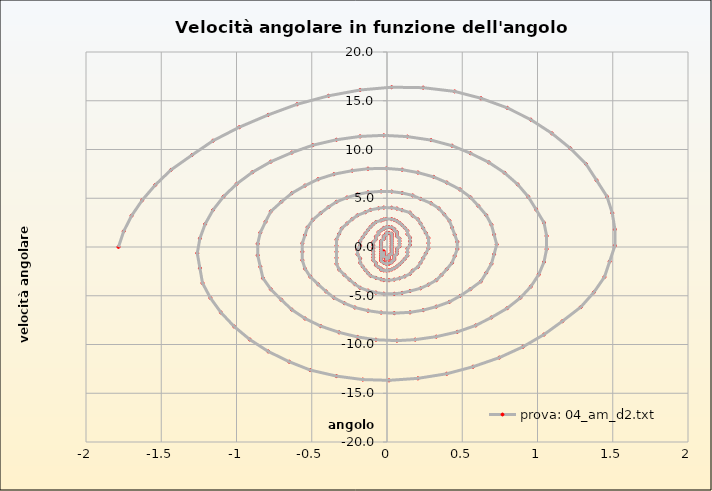
| Category | prova: 04_am_d2.txt |
|---|---|
| -1.7842898446441338 | 0 |
| -1.7493832596041339 | 1.613 |
| -1.6970233820441338 | 3.207 |
| -1.6272102119641338 | 4.789 |
| -1.539943749364134 | 6.357 |
| -1.4352239942541338 | 7.909 |
| -1.2955976540941339 | 9.43 |
| -1.1559713139341339 | 10.9 |
| -0.9814383887311339 | 12.287 |
| -0.7894521710111339 | 13.55 |
| -0.5974659532921338 | 14.64 |
| -0.3880264430531338 | 15.508 |
| -0.1785869328131338 | 16.104 |
| 0.030852577425766213 | 16.389 |
| 0.24029208766486623 | 16.341 |
| 0.4497315979048662 | 15.957 |
| 0.6242645231038662 | 15.256 |
| 0.7987974483028661 | 14.273 |
| 0.9558770809828662 | 13.056 |
| 1.095503421145866 | 11.657 |
| 1.217676468785866 | 10.127 |
| 1.3223962239058662 | 8.512 |
| 1.3922093939858662 | 6.848 |
| 1.4620225640658662 | 5.163 |
| 1.4969291491058663 | 3.476 |
| 1.5143824416258662 | 1.801 |
| 1.5143824416258662 | 0.145 |
| 1.4794758565858661 | -1.485 |
| 1.4445692715458662 | -3.085 |
| 1.3747561014658662 | -4.647 |
| 1.287489638865866 | -6.162 |
| 1.165316591225866 | -7.613 |
| 1.0431435435858663 | -8.979 |
| 0.9035172034228661 | -10.235 |
| 0.7464375707438662 | -11.347 |
| 0.5719046455438662 | -12.28 |
| 0.39737172034486623 | -12.999 |
| 0.20538550262486624 | -13.472 |
| 0.013399284905866215 | -13.676 |
| -0.16113364029313376 | -13.598 |
| -0.3356665654931338 | -13.242 |
| -0.5101994906921339 | -12.622 |
| -0.6498258308521339 | -11.766 |
| -0.7894521710111339 | -10.709 |
| -0.9116252186511339 | -9.489 |
| -1.016344973774134 | -8.145 |
| -1.1036114363741338 | -6.713 |
| -1.1734246064541338 | -5.223 |
| -1.2257844840141339 | -3.701 |
| -1.2432377765341338 | -2.166 |
| -1.2606910690541338 | -0.637 |
| -1.2432377765341338 | 0.875 |
| -1.208331191494134 | 2.355 |
| -1.1559713139341339 | 3.792 |
| -1.086158143854134 | 5.168 |
| -0.9988916812541337 | 6.468 |
| -0.8941719261311338 | 7.67 |
| -0.7719988784911338 | 8.751 |
| -0.6323725383321338 | 9.683 |
| -0.4927461981721338 | 10.442 |
| -0.3356665654931338 | 11.002 |
| -0.1785869328131338 | 11.342 |
| -0.021507300134033784 | 11.451 |
| 0.13557233254586623 | 11.323 |
| 0.29265196522486625 | 10.964 |
| 0.4322783053848662 | 10.388 |
| 0.5544513530238662 | 9.617 |
| 0.6766244006638662 | 8.679 |
| 0.7813441557838662 | 7.603 |
| 0.8686106183828661 | 6.419 |
| 0.9384237884628662 | 5.156 |
| 0.9907836660228662 | 3.84 |
| 1.0431435435858663 | 2.493 |
| 1.0605968361058662 | 1.136 |
| 1.0605968361058662 | -0.214 |
| 1.0431435435858663 | -1.541 |
| 1.0082369585428663 | -2.828 |
| 0.9558770809828662 | -4.059 |
| 0.8860639109028662 | -5.215 |
| 0.7987974483028661 | -6.279 |
| 0.6940776931838661 | -7.229 |
| 0.5893579380638662 | -8.045 |
| 0.4671848904248662 | -8.707 |
| 0.32755855026486624 | -9.197 |
| 0.18793221010486622 | -9.499 |
| 0.06575916246566621 | -9.605 |
| -0.07386717769383379 | -9.513 |
| -0.19604022533313378 | -9.226 |
| -0.3182132729731338 | -8.755 |
| -0.44038632061313376 | -8.116 |
| -0.5451060757321339 | -7.331 |
| -0.6323725383321338 | -6.423 |
| -0.7021857084121338 | -5.415 |
| -0.7719988784911338 | -4.331 |
| -0.8243587560511338 | -3.195 |
| -0.8418120485711338 | -2.028 |
| -0.8592653410911338 | -0.848 |
| -0.8592653410911338 | 0.327 |
| -0.8418120485711338 | 1.478 |
| -0.8069054635311338 | 2.589 |
| -0.7719988784911338 | 3.643 |
| -0.7021857084121338 | 4.624 |
| -0.6323725383321338 | 5.514 |
| -0.5451060757321339 | 6.295 |
| -0.4578396131321338 | 6.951 |
| -0.3531198580131338 | 7.466 |
| -0.23094681037313378 | 7.829 |
| -0.12622705525413377 | 8.029 |
| -0.004054007614033786 | 8.062 |
| 0.10066574750556621 | 7.928 |
| 0.20538550262486624 | 7.634 |
| 0.31010525774486625 | 7.188 |
| 0.39737172034486623 | 6.605 |
| 0.48463818294386624 | 5.903 |
| 0.5544513530238662 | 5.1 |
| 0.6068112305838662 | 4.216 |
| 0.6591711081438661 | 3.271 |
| 0.6940776931838661 | 2.284 |
| 0.7115309857038662 | 1.274 |
| 0.7289842782238661 | 0.259 |
| 0.7115309857038662 | -0.745 |
| 0.6940776931838661 | -1.72 |
| 0.6591711081438661 | -2.652 |
| 0.6242645231038662 | -3.525 |
| 0.5544513530238662 | -4.322 |
| 0.48463818294386624 | -5.029 |
| 0.4148250128648662 | -5.633 |
| 0.32755855026486624 | -6.119 |
| 0.24029208766486623 | -6.478 |
| 0.15302562506586623 | -6.702 |
| 0.04830586994576621 | -6.785 |
| -0.038960592653933784 | -6.728 |
| -0.12622705525413377 | -6.533 |
| -0.21349351785313378 | -6.206 |
| -0.2833066879331338 | -5.759 |
| -0.3531198580131338 | -5.204 |
| -0.40547973557313377 | -4.555 |
| -0.4578396131321338 | -3.829 |
| -0.5101994906921339 | -3.043 |
| -0.5451060757321339 | -2.213 |
| -0.5625593682521338 | -1.356 |
| -0.5625593682521338 | -0.489 |
| -0.5625593682521338 | 0.374 |
| -0.5451060757321339 | 1.217 |
| -0.5276527832121338 | 2.025 |
| -0.4927461981721338 | 2.784 |
| -0.44038632061313376 | 3.48 |
| -0.3880264430531338 | 4.101 |
| -0.3356665654931338 | 4.634 |
| -0.2658533954131338 | 5.068 |
| -0.19604022533313378 | 5.396 |
| -0.12622705525413377 | 5.609 |
| -0.038960592653933784 | 5.705 |
| 0.030852577425766213 | 5.682 |
| 0.10066574750556621 | 5.542 |
| 0.17047891758486622 | 5.29 |
| 0.22283879514486624 | 4.934 |
| 0.29265196522486625 | 4.484 |
| 0.34501184278486624 | 3.951 |
| 0.37991842782486623 | 3.349 |
| 0.4148250128648662 | 2.691 |
| 0.4322783053848662 | 1.993 |
| 0.4497315979048662 | 1.267 |
| 0.4671848904248662 | 0.53 |
| 0.4671848904248662 | -0.206 |
| 0.4497315979048662 | -0.927 |
| 0.4322783053848662 | -1.619 |
| 0.39737172034486623 | -2.27 |
| 0.36246513530486624 | -2.868 |
| 0.32755855026486624 | -3.401 |
| 0.27519867270486625 | -3.861 |
| 0.22283879514486624 | -4.236 |
| 0.15302562506586623 | -4.521 |
| 0.10066574750556621 | -4.71 |
| 0.04830586994576621 | -4.8 |
| -0.021507300134033784 | -4.789 |
| -0.07386717769383379 | -4.68 |
| -0.12622705525413377 | -4.476 |
| -0.1785869328131338 | -4.184 |
| -0.21349351785313378 | -3.81 |
| -0.2484001028931338 | -3.366 |
| -0.2833066879331338 | -2.862 |
| -0.3182132729731338 | -2.309 |
| -0.3356665654931338 | -1.719 |
| -0.3356665654931338 | -1.105 |
| -0.3356665654931338 | -0.48 |
| -0.3356665654931338 | 0.145 |
| -0.3356665654931338 | 0.757 |
| -0.3182132729731338 | 1.345 |
| -0.3007599804531338 | 1.899 |
| -0.2658533954131338 | 2.406 |
| -0.23094681037313378 | 2.859 |
| -0.19604022533313378 | 3.248 |
| -0.14368034777313377 | 3.566 |
| -0.10877376273413379 | 3.807 |
| -0.05641388517393378 | 3.966 |
| -0.021507300134033784 | 4.042 |
| 0.030852577425766213 | 4.034 |
| 0.06575916246566621 | 3.942 |
| 0.10066574750556621 | 3.77 |
| 0.15302562506586623 | 3.524 |
| 0.17047891758486622 | 3.21 |
| 0.20538550262486624 | 2.835 |
| 0.22283879514486624 | 2.409 |
| 0.24029208766486623 | 1.941 |
| 0.2577453801848662 | 1.442 |
| 0.27519867270486625 | 0.923 |
| 0.27519867270486625 | 0.393 |
| 0.27519867270486625 | -0.136 |
| 0.2577453801848662 | -0.654 |
| 0.24029208766486623 | -1.151 |
| 0.22283879514486624 | -1.618 |
| 0.20538550262486624 | -2.046 |
| 0.17047891758486622 | -2.426 |
| 0.15302562506586623 | -2.751 |
| 0.1181190400258662 | -3.016 |
| 0.0832124549856662 | -3.216 |
| 0.04830586994576621 | -3.347 |
| 0.013399284905866215 | -3.406 |
| -0.021507300134033784 | -3.395 |
| -0.038960592653933784 | -3.314 |
| -0.07386717769383379 | -3.166 |
| -0.10877376273413379 | -2.955 |
| -0.12622705525413377 | -2.687 |
| -0.14368034777313377 | -2.368 |
| -0.16113364029313376 | -2.006 |
| -0.1785869328131338 | -1.609 |
| -0.1785869328131338 | -1.186 |
| -0.19604022533313378 | -0.746 |
| -0.19604022533313378 | -0.298 |
| -0.1785869328131338 | 0.149 |
| -0.1785869328131338 | 0.586 |
| -0.16113364029313376 | 1.004 |
| -0.14368034777313377 | 1.396 |
| -0.12622705525413377 | 1.754 |
| -0.10877376273413379 | 2.071 |
| -0.09132047021413378 | 2.342 |
| -0.07386717769383379 | 2.56 |
| -0.038960592653933784 | 2.723 |
| -0.021507300134033784 | 2.827 |
| -0.004054007614033786 | 2.872 |
| 0.030852577425766213 | 2.856 |
| 0.04830586994576621 | 2.782 |
| 0.06575916246566621 | 2.652 |
| 0.0832124549856662 | 2.469 |
| 0.10066574750556621 | 2.239 |
| 0.1181190400258662 | 1.966 |
| 0.13557233254586623 | 1.657 |
| 0.13557233254586623 | 1.32 |
| 0.15302562506586623 | 0.961 |
| 0.15302562506586623 | 0.588 |
| 0.15302562506586623 | 0.209 |
| 0.13557233254586623 | -0.168 |
| 0.13557233254586623 | -0.536 |
| 0.13557233254586623 | -0.887 |
| 0.1181190400258662 | -1.215 |
| 0.10066574750556621 | -1.513 |
| 0.0832124549856662 | -1.776 |
| 0.06575916246566621 | -1.999 |
| 0.04830586994576621 | -2.177 |
| 0.030852577425766213 | -2.308 |
| 0.013399284905866215 | -2.39 |
| -0.004054007614033786 | -2.421 |
| -0.021507300134033784 | -2.402 |
| -0.038960592653933784 | -2.333 |
| -0.038960592653933784 | -2.217 |
| -0.05641388517393378 | -2.058 |
| -0.07386717769383379 | -1.859 |
| -0.07386717769383379 | -1.624 |
| -0.09132047021413378 | -1.36 |
| -0.09132047021413378 | -1.073 |
| -0.09132047021413378 | -0.768 |
| -0.09132047021413378 | -0.452 |
| -0.09132047021413378 | -0.133 |
| -0.09132047021413378 | 0.185 |
| -0.09132047021413378 | 0.494 |
| -0.07386717769383379 | 0.788 |
| -0.07386717769383379 | 1.062 |
| -0.05641388517393378 | 1.309 |
| -0.05641388517393378 | 1.526 |
| -0.038960592653933784 | 1.709 |
| -0.021507300134033784 | 1.854 |
| -0.021507300134033784 | 1.958 |
| -0.004054007614033786 | 2.02 |
| 0.013399284905866215 | 2.04 |
| 0.030852577425766213 | 2.018 |
| 0.030852577425766213 | 1.954 |
| 0.04830586994576621 | 1.851 |
| 0.04830586994576621 | 1.711 |
| 0.06575916246566621 | 1.538 |
| 0.06575916246566621 | 1.337 |
| 0.06575916246566621 | 1.111 |
| 0.0832124549856662 | 0.866 |
| 0.0832124549856662 | 0.607 |
| 0.0832124549856662 | 0.34 |
| 0.0832124549856662 | 0.07 |
| 0.06575916246566621 | -0.197 |
| 0.06575916246566621 | -0.456 |
| 0.06575916246566621 | -0.702 |
| 0.04830586994576621 | -0.93 |
| 0.04830586994576621 | -1.135 |
| 0.04830586994576621 | -1.313 |
| 0.030852577425766213 | -1.462 |
| 0.030852577425766213 | -1.579 |
| 0.013399284905866215 | -1.661 |
| 0.013399284905866215 | -1.708 |
| -0.004054007614033786 | -1.719 |
| -0.004054007614033786 | -1.694 |
| -0.021507300134033784 | -1.635 |
| -0.021507300134033784 | -1.542 |
| -0.038960592653933784 | -1.42 |
| -0.038960592653933784 | -1.27 |
| -0.038960592653933784 | -1.097 |
| -0.038960592653933784 | -0.903 |
| -0.038960592653933784 | -0.694 |
| -0.038960592653933784 | -0.474 |
| -0.038960592653933784 | -0.248 |
| -0.038960592653933784 | -0.021 |
| -0.038960592653933784 | 0.204 |
| -0.038960592653933784 | 0.421 |
| -0.038960592653933784 | 0.626 |
| -0.021507300134033784 | 0.815 |
| -0.021507300134033784 | 0.984 |
| -0.021507300134033784 | 1.131 |
| -0.004054007614033786 | 1.251 |
| -0.004054007614033786 | 1.345 |
| -0.004054007614033786 | 1.409 |
| 0.013399284905866215 | 1.443 |
| 0.013399284905866215 | 1.447 |
| 0.013399284905866215 | 1.421 |
| 0.030852577425766213 | 1.366 |
| 0.030852577425766213 | 1.284 |
| 0.030852577425766213 | 1.176 |
| 0.030852577425766213 | 1.046 |
| 0.030852577425766213 | 0.897 |
| 0.030852577425766213 | 0.731 |
| 0.030852577425766213 | 0.553 |
| 0.030852577425766213 | 0.366 |
| 0.030852577425766213 | 0.175 |
| 0.030852577425766213 | -0.017 |
| 0.030852577425766213 | -0.205 |
| 0.030852577425766213 | -0.386 |
| 0.030852577425766213 | -0.557 |
| 0.030852577425766213 | -0.714 |
| 0.013399284905866215 | -0.853 |
| 0.013399284905866215 | -0.973 |
| 0.013399284905866215 | -1.071 |
| 0.013399284905866215 | -1.145 |
| 0.013399284905866215 | -1.195 |
| -0.004054007614033786 | -1.219 |
| -0.004054007614033786 | -1.217 |
| -0.004054007614033786 | -1.191 |
| -0.004054007614033786 | -1.14 |
| -0.004054007614033786 | -1.067 |
| -0.021507300134033784 | -0.973 |
| -0.021507300134033784 | -0.86 |
| -0.021507300134033784 | -0.731 |
| -0.021507300134033784 | -0.59 |
| -0.021507300134033784 | -0.438 |